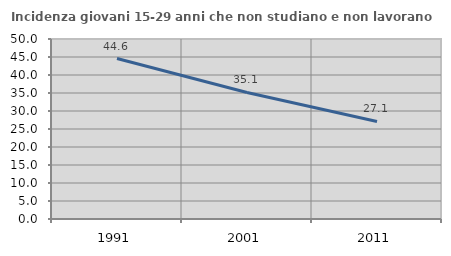
| Category | Incidenza giovani 15-29 anni che non studiano e non lavorano  |
|---|---|
| 1991.0 | 44.567 |
| 2001.0 | 35.14 |
| 2011.0 | 27.096 |